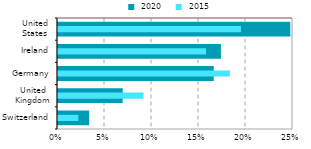
| Category |  2020 |
|---|---|
| Switzerland | 0.033 |
| United
Kingdom | 0.069 |
| Germany | 0.166 |
| Ireland | 0.173 |
| United
States | 0.247 |